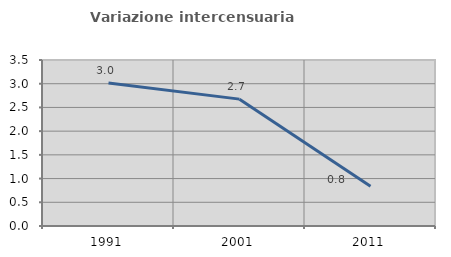
| Category | Variazione intercensuaria annua |
|---|---|
| 1991.0 | 3.013 |
| 2001.0 | 2.675 |
| 2011.0 | 0.839 |